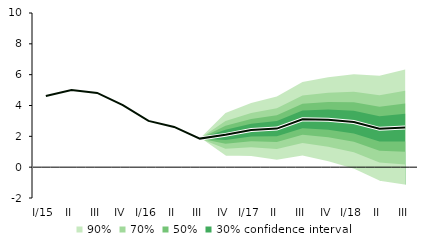
| Category | linka | Střed předpovědi |
|---|---|---|
| I/15 | 4.618 | 4.618 |
| II | 5.004 | 5.004 |
| III | 4.815 | 4.815 |
| IV | 4.027 | 4.027 |
| I/16 | 3 | 3 |
| II | 2.608 | 2.608 |
| III | 1.853 | 1.853 |
| IV | 2.096 | 2.096 |
| I/17 | 2.407 | 2.407 |
| II | 2.504 | 2.504 |
| III | 3.106 | 3.106 |
| IV | 3.078 | 3.078 |
| I/18 | 2.927 | 2.927 |
| II | 2.488 | 2.488 |
| III | 2.57 | 2.57 |